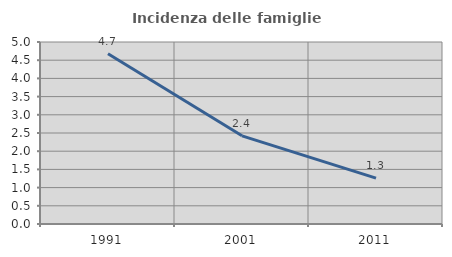
| Category | Incidenza delle famiglie numerose |
|---|---|
| 1991.0 | 4.677 |
| 2001.0 | 2.422 |
| 2011.0 | 1.262 |